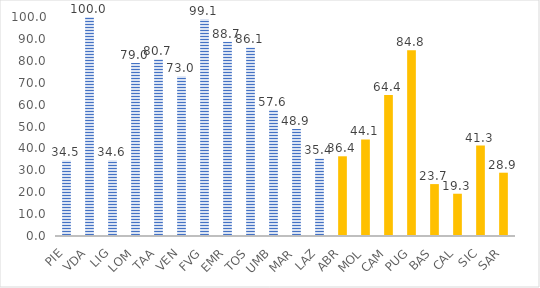
| Category | nidi e sezioni primavera |
|---|---|
| PIE | 34.5 |
| VDA | 100 |
| LIG | 34.6 |
| LOM | 79 |
| TAA | 80.7 |
| VEN | 73 |
| FVG | 99.1 |
| EMR | 88.7 |
| TOS | 86.1 |
| UMB | 57.6 |
| MAR | 48.9 |
| LAZ | 35.4 |
| ABR | 36.4 |
| MOL | 44.1 |
| CAM | 64.4 |
| PUG | 84.8 |
| BAS | 23.7 |
| CAL | 19.3 |
| SIC | 41.3 |
| SAR | 28.9 |